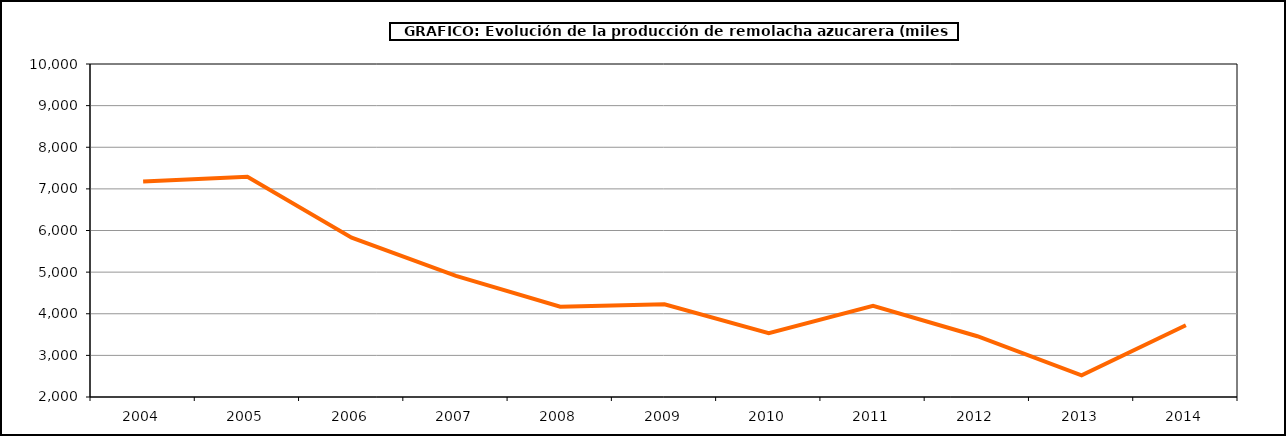
| Category | Producción |
|---|---|
| 2004.0 | 7174.942 |
| 2005.0 | 7291.092 |
| 2006.0 | 5827.031 |
| 2007.0 | 4909.958 |
| 2008.0 | 4170.442 |
| 2009.0 | 4225.433 |
| 2010.0 | 3534.517 |
| 2011.0 | 4188.535 |
| 2012.0 | 3460.23 |
| 2013.0 | 2519.482 |
| 2014.0 | 3723.309 |